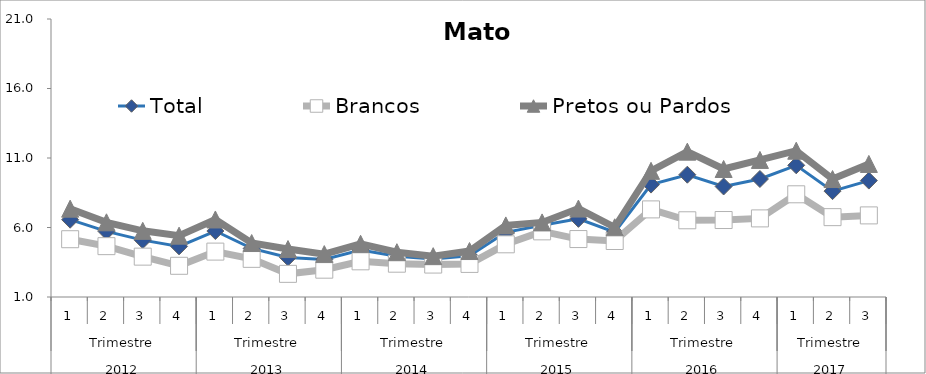
| Category | Total | Brancos | Pretos ou Pardos |
|---|---|---|---|
| 0 | 6.562 | 5.157 | 7.354 |
| 1 | 5.722 | 4.658 | 6.374 |
| 2 | 5.091 | 3.903 | 5.759 |
| 3 | 4.643 | 3.244 | 5.413 |
| 4 | 5.747 | 4.266 | 6.577 |
| 5 | 4.493 | 3.744 | 4.883 |
| 6 | 3.847 | 2.666 | 4.448 |
| 7 | 3.696 | 2.965 | 4.087 |
| 8 | 4.386 | 3.567 | 4.828 |
| 9 | 3.926 | 3.396 | 4.222 |
| 10 | 3.741 | 3.333 | 3.938 |
| 11 | 3.968 | 3.381 | 4.307 |
| 12 | 5.653 | 4.791 | 6.15 |
| 13 | 6.157 | 5.723 | 6.366 |
| 14 | 6.622 | 5.169 | 7.362 |
| 15 | 5.662 | 5.028 | 6.016 |
| 16 | 9.087 | 7.302 | 10.077 |
| 17 | 9.798 | 6.52 | 11.457 |
| 18 | 8.952 | 6.537 | 10.21 |
| 19 | 9.49 | 6.654 | 10.861 |
| 20 | 10.474 | 8.389 | 11.524 |
| 21 | 8.617 | 6.744 | 9.486 |
| 22 | 9.375 | 6.87 | 10.572 |